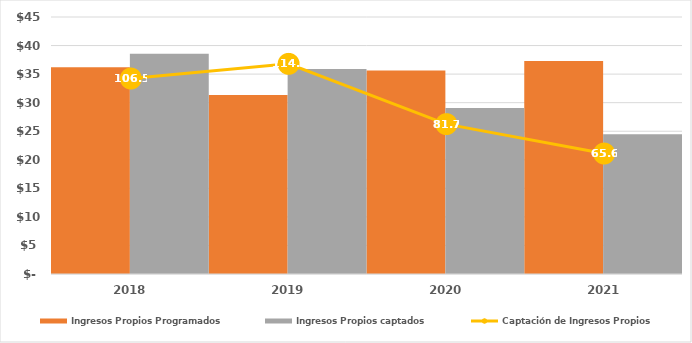
| Category | Ingresos Propios Programados | Ingresos Propios captados |
|---|---|---|
| 2018.0 | 36202.904 | 38547 |
| 2019.0 | 31360.433 | 35900.04 |
| 2020.0 | 35617.842 | 29082.971 |
| 2021.0 | 37312.722 | 24484.657 |